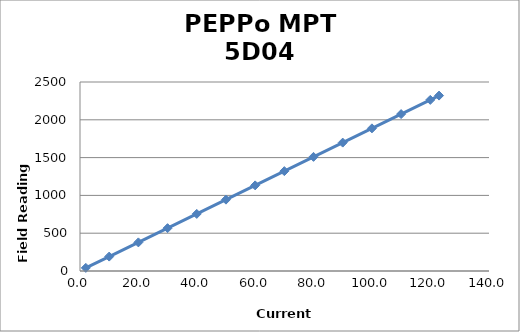
| Category | Series 0 |
|---|---|
| 1.992 | 41.4 |
| 9.9895 | 190.6 |
| 19.98 | 378.5 |
| 29.973499999999998 | 566.7 |
| 39.964 | 755.2 |
| 49.961 | 943.8 |
| 59.951 | 1132.4 |
| 69.94500000000001 | 1321 |
| 79.935 | 1509.6 |
| 89.92999999999999 | 1698.4 |
| 99.925 | 1886.8 |
| 109.915 | 2075.3 |
| 119.905 | 2263.5 |
| 122.905 | 2320.2 |